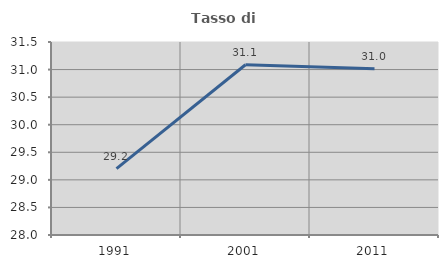
| Category | Tasso di occupazione   |
|---|---|
| 1991.0 | 29.203 |
| 2001.0 | 31.087 |
| 2011.0 | 31.013 |